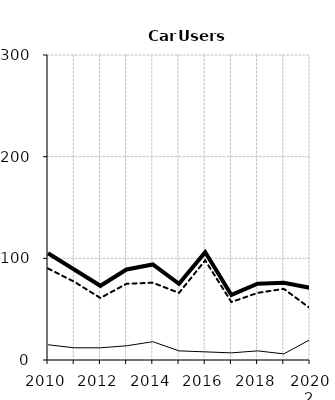
| Category | Built-up | Non built-up | Total |
|---|---|---|---|
| 2010 | 15 | 90 | 105 |
| 2011 | 12 | 77 | 89 |
| 2012 | 12 | 61 | 73 |
| 2013 | 14 | 75 | 89 |
| 2014 | 18 | 76 | 94 |
| 2015 | 9 | 66 | 75 |
| 2016 | 8 | 98 | 106 |
| 2017 | 7 | 57 | 64 |
| 2018 | 9 | 66 | 75 |
| 2019 2 | 6 | 70 | 76 |
| 2020 2 | 20 | 51 | 71 |